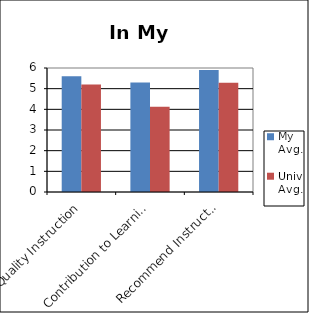
| Category | My Avg. | Univ. Avg. |
|---|---|---|
| Quality Instruction | 5.6 | 5.2 |
| Contribution to Learning | 5.3 | 4.13 |
| Recommend Instructor | 5.9 | 5.29 |